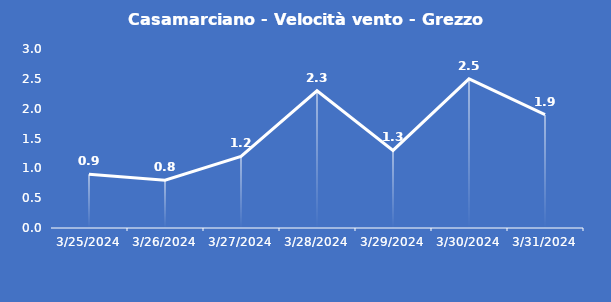
| Category | Casamarciano - Velocità vento - Grezzo (m/s) |
|---|---|
| 3/25/24 | 0.9 |
| 3/26/24 | 0.8 |
| 3/27/24 | 1.2 |
| 3/28/24 | 2.3 |
| 3/29/24 | 1.3 |
| 3/30/24 | 2.5 |
| 3/31/24 | 1.9 |